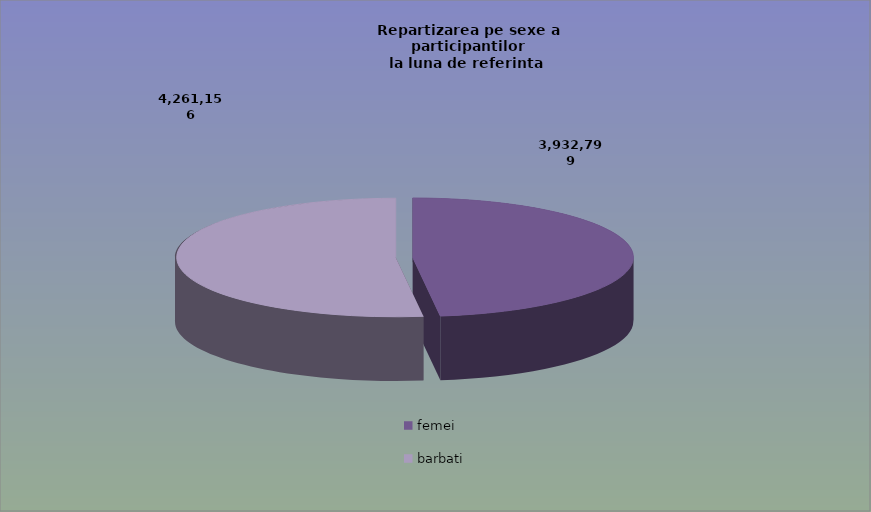
| Category | Series 0 |
|---|---|
| femei | 3932799 |
| barbati | 4261156 |